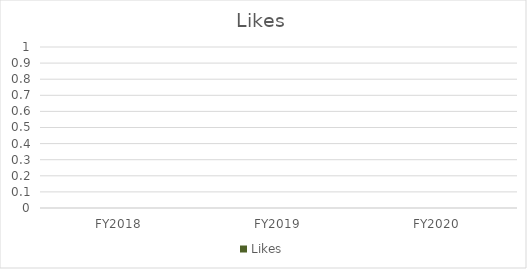
| Category | Likes |
|---|---|
| FY2018 | 0 |
| FY2019 | 0 |
| FY2020 | 0 |